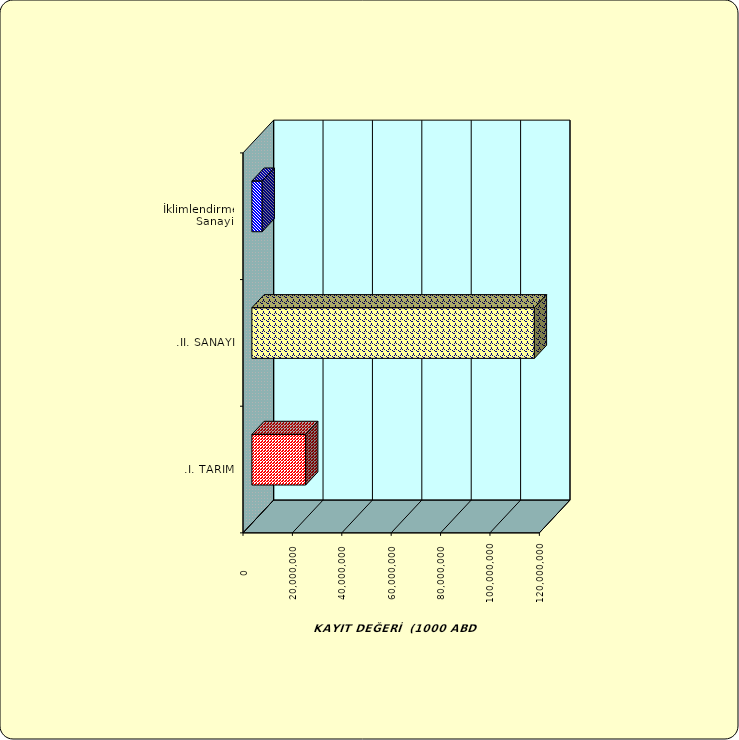
| Category | Series 0 |
|---|---|
| .I. TARIM | 21773662.095 |
| .II. SANAYİ | 114379651.71 |
|  İklimlendirme Sanayii | 4176674.934 |